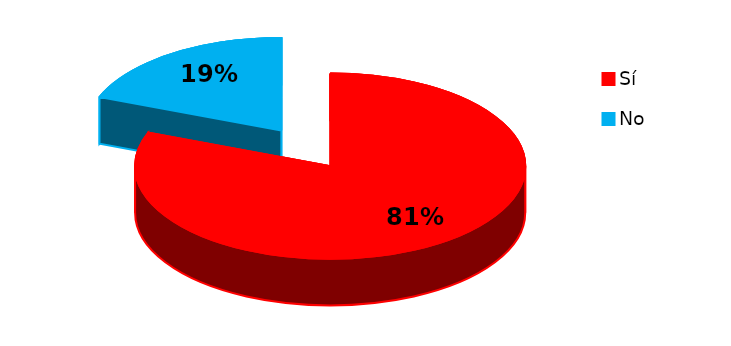
| Category | Series 0 |
|---|---|
| 0 | 127 |
| 1 | 30 |